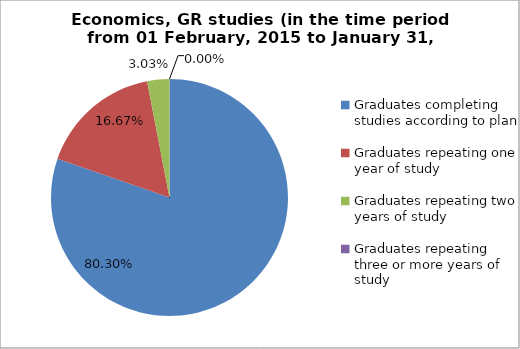
| Category | Series 0 |
|---|---|
| Graduates completing studies according to plan | 80.303 |
| Graduates repeating one year of study | 16.667 |
| Graduates repeating two years of study | 3.03 |
| Graduates repeating three or more years of study | 0 |